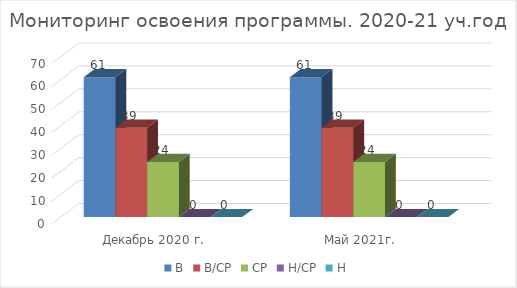
| Category | В | В/СР | СР | Н/СР | Н |
|---|---|---|---|---|---|
| Декабрь 2020 г. | 61 | 39 | 24 | 0 | 0 |
| Май 2021г. | 61 | 39 | 24 | 0 | 0 |